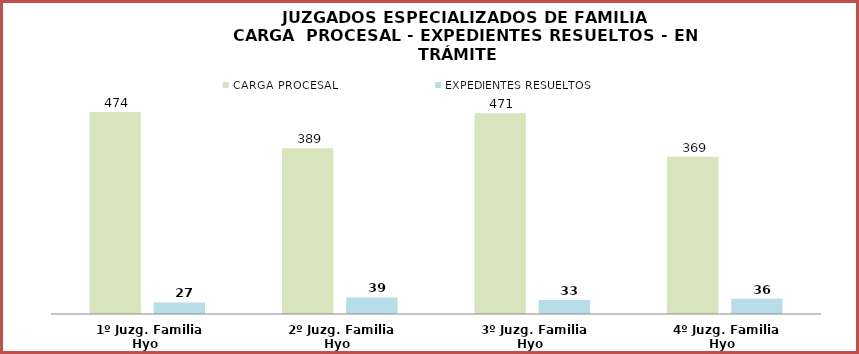
| Category | CARGA PROCESAL | EXPEDIENTES RESUELTOS |
|---|---|---|
| 1º Juzg. Familia Hyo | 474 | 27 |
| 2º Juzg. Familia Hyo | 389 | 39 |
| 3º Juzg. Familia Hyo | 471 | 33 |
| 4º Juzg. Familia Hyo | 369 | 36 |